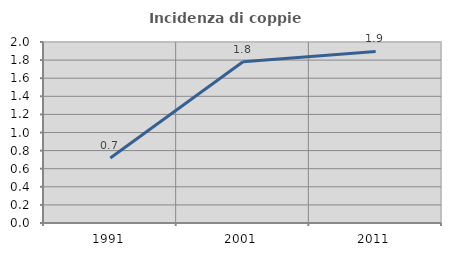
| Category | Incidenza di coppie miste |
|---|---|
| 1991.0 | 0.717 |
| 2001.0 | 1.781 |
| 2011.0 | 1.896 |